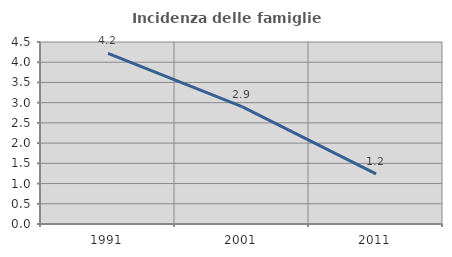
| Category | Incidenza delle famiglie numerose |
|---|---|
| 1991.0 | 4.22 |
| 2001.0 | 2.904 |
| 2011.0 | 1.241 |